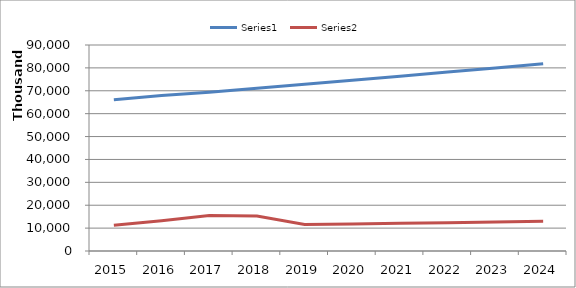
| Category | Series 0 | Series 1 |
|---|---|---|
| 2015.0 | 66030852 | 11269531 |
| 2016.0 | 67936363 | 13222617 |
| 2017.0 | 69363027 | 15498842 |
| 2018.0 | 71097103 | 15273813 |
| 2019.0 | 72803433 | 11544385 |
| 2020.0 | 74550715 | 11821450 |
| 2021.0 | 76339932 | 12105165 |
| 2022.0 | 78172090 | 12395689 |
| 2023.0 | 79970048 | 12680790 |
| 2024.0 | 81809359 | 12972448 |